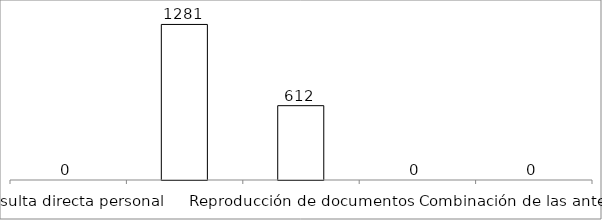
| Category | Series 0 |
|---|---|
| Consulta directa personal | 0 |
| Consulta directa electrónica | 1281 |
| Reproducción de documentos | 612 |
| Elaboración de informes | 0 |
| Combinación de las anteriores | 0 |